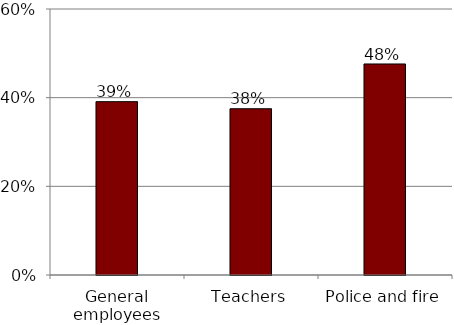
| Category | Series 0 |
|---|---|
| General employees | 0.391 |
| Teachers | 0.375 |
| Police and fire | 0.476 |